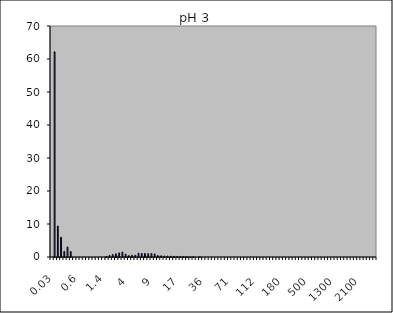
| Category | Magnetite pH 3 1Nb |
|---|---|
| 0.03 | 0 |
| 0.04 | 62.179 |
| 0.07 | 9.371 |
| 0.1 | 5.978 |
| 0.2 | 1.688 |
| 0.3 | 3.047 |
| 0.4 | 1.651 |
| 0.5 | 0 |
| 0.6 | 0 |
| 0.7 | 0 |
| 0.8 | 0 |
| 0.9 | 0 |
| 1.0 | 0 |
| 1.1 | 0 |
| 1.2 | 0 |
| 1.3 | 0 |
| 1.4 | 0 |
| 1.6 | 0.156 |
| 1.8 | 0.479 |
| 2.0 | 0.733 |
| 2.2 | 0.966 |
| 2.4 | 1.229 |
| 2.6 | 1.484 |
| 3.0 | 0.851 |
| 4.0 | 0.413 |
| 5.0 | 0.506 |
| 6.0 | 0.521 |
| 6.5 | 1.113 |
| 7.0 | 1.082 |
| 7.5 | 1.076 |
| 8.0 | 1.012 |
| 8.5 | 1.029 |
| 9.0 | 0.935 |
| 10.0 | 0.423 |
| 11.0 | 0.374 |
| 12.0 | 0.307 |
| 13.0 | 0.297 |
| 14.0 | 0.24 |
| 15.0 | 0.172 |
| 16.0 | 0.184 |
| 17.0 | 0.147 |
| 18.0 | 0.104 |
| 19.0 | 0.11 |
| 20.0 | 0.058 |
| 22.0 | 0.062 |
| 25.0 | 0 |
| 28.0 | 0.026 |
| 32.0 | 0 |
| 36.0 | 0 |
| 38.0 | 0 |
| 40.0 | 0 |
| 45.0 | 0 |
| 50.0 | 0 |
| 53.0 | 0 |
| 56.0 | 0 |
| 63.0 | 0 |
| 71.0 | 0 |
| 75.0 | 0 |
| 80.0 | 0 |
| 85.0 | 0 |
| 90.0 | 0 |
| 95.0 | 0 |
| 100.0 | 0 |
| 106.0 | 0 |
| 112.0 | 0 |
| 125.0 | 0 |
| 130.0 | 0 |
| 140.0 | 0 |
| 145.0 | 0 |
| 150.0 | 0 |
| 160.0 | 0 |
| 170.0 | 0 |
| 180.0 | 0 |
| 190.0 | 0 |
| 200.0 | 0 |
| 212.0 | 0 |
| 242.0 | 0 |
| 250.0 | 0 |
| 300.0 | 0 |
| 400.0 | 0 |
| 500.0 | 0 |
| 600.0 | 0 |
| 700.0 | 0 |
| 800.0 | 0 |
| 900.0 | 0 |
| 1000.0 | 0 |
| 1100.0 | 0 |
| 1200.0 | 0 |
| 1300.0 | 0 |
| 1400.0 | 0 |
| 1500.0 | 0 |
| 1600.0 | 0 |
| 1700.0 | 0 |
| 1800.0 | 0 |
| 1900.0 | 0 |
| 2000.0 | 0 |
| 2100.0 | 0 |
| 2200.0 | 0 |
| 2300.0 | 0 |
| 2400.0 | 0 |
| 2500.0 | 0 |